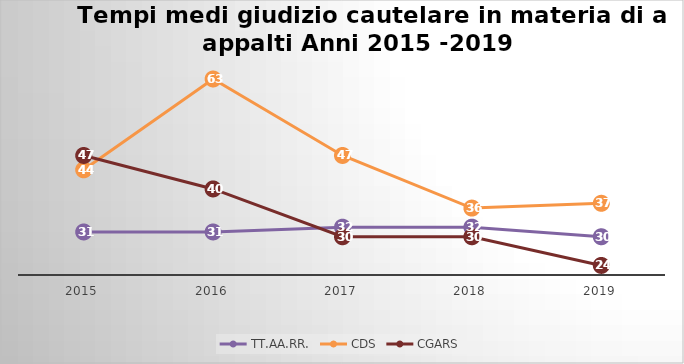
| Category | TT.AA.RR. | CDS | CGARS |
|---|---|---|---|
| 2015.0 | 31 | 44 | 47 |
| 2016.0 | 31 | 63 | 40 |
| 2017.0 | 32 | 47 | 30 |
| 2018.0 | 32 | 36 | 30 |
| 2019.0 | 30 | 37 | 24 |